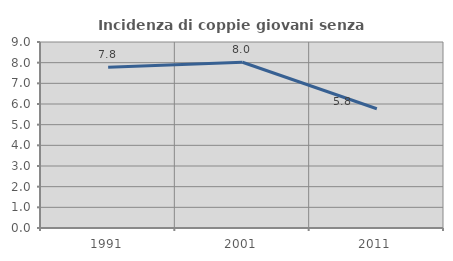
| Category | Incidenza di coppie giovani senza figli |
|---|---|
| 1991.0 | 7.784 |
| 2001.0 | 8.02 |
| 2011.0 | 5.77 |